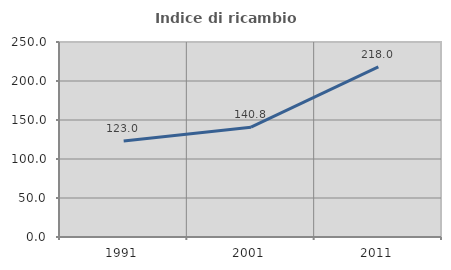
| Category | Indice di ricambio occupazionale  |
|---|---|
| 1991.0 | 123.049 |
| 2001.0 | 140.79 |
| 2011.0 | 218.037 |